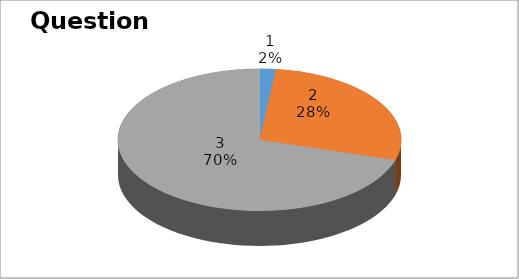
| Category | Series 0 |
|---|---|
| 0 | 1 |
| 1 | 15 |
| 2 | 38 |